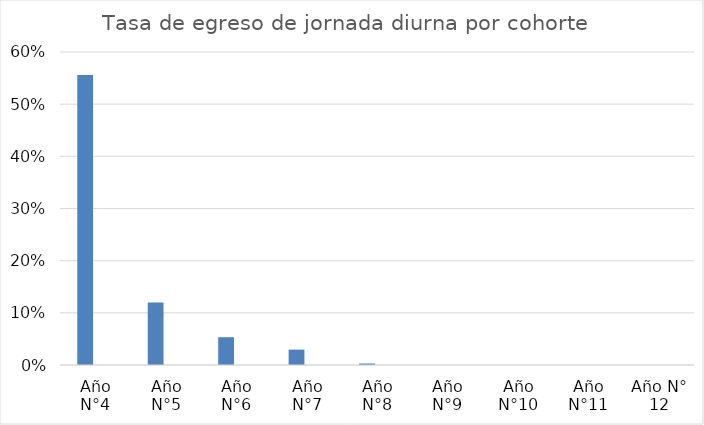
| Category | Series 0 | series2 |
|---|---|---|
| Año N°4 | 0.556 | 0 |
| Año N°5 | 0.12 | 0 |
| Año N°6 | 0.053 | 0 |
| Año N°7 | 0.029 | 0 |
| Año N°8 | 0.003 | 0 |
| Año N°9 | 0 | 0 |
| Año N°10 | 0 | 0 |
| Año N°11 | 0 | 0 |
| Año N° 12 | 0 | 0 |